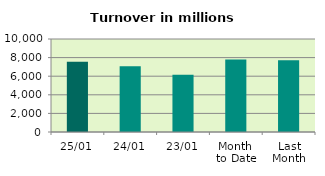
| Category | Series 0 |
|---|---|
| 25/01 | 7543.841 |
| 24/01 | 7063.082 |
| 23/01 | 6161.972 |
| Month 
to Date | 7789.155 |
| Last
Month | 7707.734 |